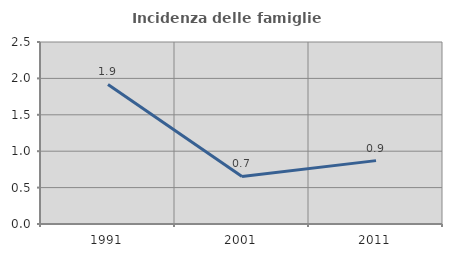
| Category | Incidenza delle famiglie numerose |
|---|---|
| 1991.0 | 1.918 |
| 2001.0 | 0.653 |
| 2011.0 | 0.87 |